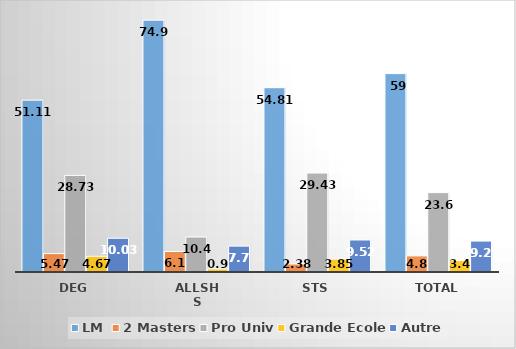
| Category | LM | 2 Masters | Pro Univ | Grande Ecole | Autre |
|---|---|---|---|---|---|
| DEG | 51.11 | 5.47 | 28.73 | 4.67 | 10.03 |
| ALLSHS | 74.9 | 6.1 | 10.4 | 0.9 | 7.7 |
| STS | 54.81 | 2.38 | 29.43 | 3.85 | 9.52 |
| Total | 59 | 4.8 | 23.6 | 3.4 | 9.2 |